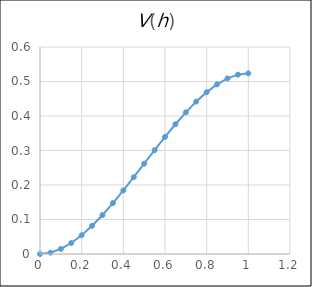
| Category | V |
|---|---|
| 0.0 | 0 |
| 0.05 | 0.004 |
| 0.1 | 0.015 |
| 0.15 | 0.032 |
| 0.2 | 0.054 |
| 0.25 | 0.082 |
| 0.3 | 0.113 |
| 0.35 | 0.148 |
| 0.4 | 0.184 |
| 0.45 | 0.223 |
| 0.5 | 0.262 |
| 0.55 | 0.301 |
| 0.6 | 0.339 |
| 0.65 | 0.376 |
| 0.7 | 0.411 |
| 0.75 | 0.442 |
| 0.8 | 0.469 |
| 0.85 | 0.492 |
| 0.9 | 0.509 |
| 0.95 | 0.52 |
| 1.0 | 0.524 |